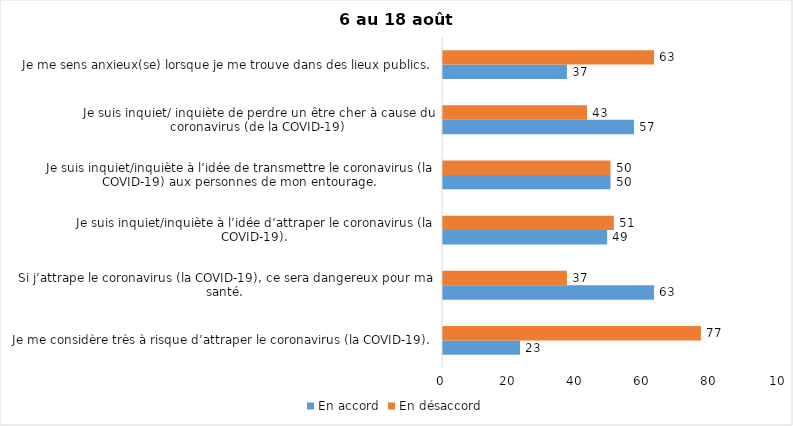
| Category | En accord | En désaccord |
|---|---|---|
| Je me considère très à risque d’attraper le coronavirus (la COVID-19). | 23 | 77 |
| Si j’attrape le coronavirus (la COVID-19), ce sera dangereux pour ma santé. | 63 | 37 |
| Je suis inquiet/inquiète à l’idée d’attraper le coronavirus (la COVID-19). | 49 | 51 |
| Je suis inquiet/inquiète à l’idée de transmettre le coronavirus (la COVID-19) aux personnes de mon entourage. | 50 | 50 |
| Je suis inquiet/ inquiète de perdre un être cher à cause du coronavirus (de la COVID-19) | 57 | 43 |
| Je me sens anxieux(se) lorsque je me trouve dans des lieux publics. | 37 | 63 |